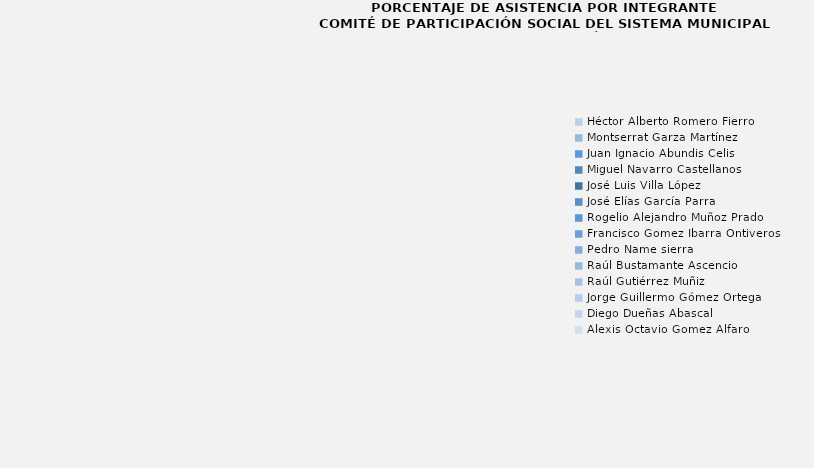
| Category | Series 0 |
|---|---|
| Héctor Alberto Romero Fierro | 0 |
| Montserrat Garza Martínez | 0 |
| Juan Ignacio Abundis Celis  | 0 |
| Miguel Navarro Castellanos | 0 |
| José Luis Villa López  | 0 |
| José Elías García Parra | 0 |
| Rogelio Alejandro Muñoz Prado | 0 |
| Francisco Gomez Ibarra Ontiveros | 0 |
| Pedro Name sierra | 0 |
| Raúl Bustamante Ascencio | 0 |
| Raúl Gutiérrez Muñiz | 0 |
| Jorge Guillermo Gómez Ortega | 0 |
| Diego Dueñas Abascal | 0 |
| Alexis Octavio Gomez Alfaro  | 0 |